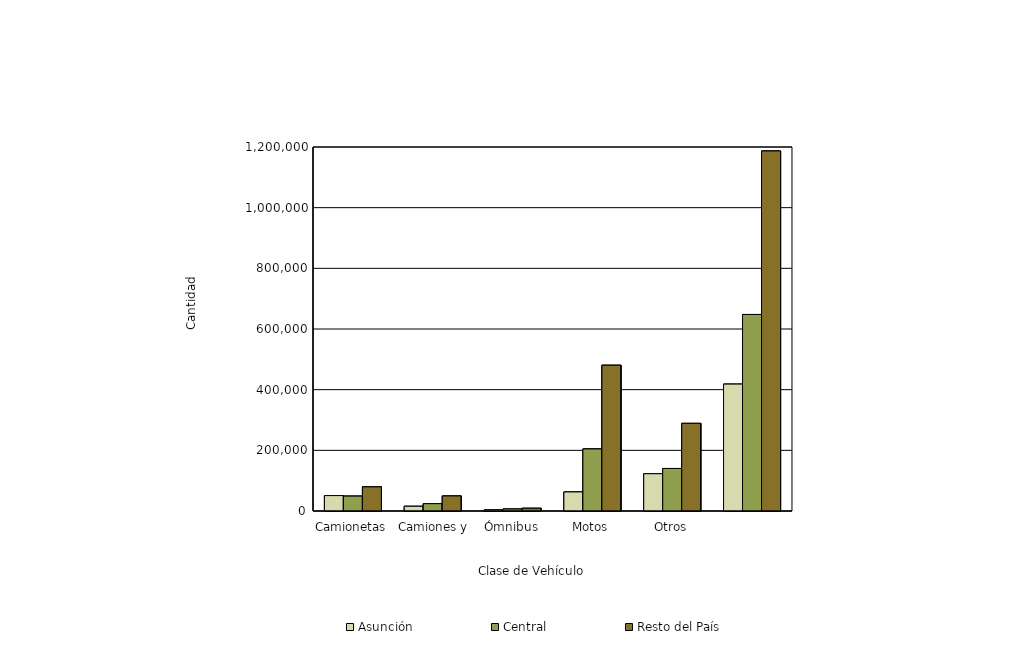
| Category | Asunción | Central | Resto del País |
|---|---|---|---|
| Camionetas | 50832 | 49104 | 79566 |
| Camiones y Acoplados | 15606 | 24108 | 49575 |
| Ómnibus | 3524 | 6569 | 9039 |
| Motos | 62854 | 204583 | 480579 |
| Otros | 122889 | 140188 | 288941 |